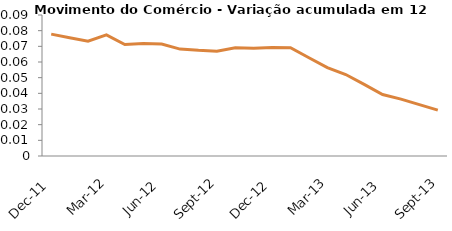
| Category | Series 5 |
|---|---|
| 2011-12-01 | 0.078 |
| 2012-01-01 | 0.075 |
| 2012-02-01 | 0.073 |
| 2012-03-01 | 0.077 |
| 2012-04-01 | 0.071 |
| 2012-05-01 | 0.072 |
| 2012-06-01 | 0.071 |
| 2012-07-01 | 0.068 |
| 2012-08-01 | 0.067 |
| 2012-09-01 | 0.067 |
| 2012-10-01 | 0.069 |
| 2012-11-01 | 0.069 |
| 2012-12-01 | 0.069 |
| 2013-01-01 | 0.069 |
| 2013-02-01 | 0.063 |
| 2013-03-01 | 0.056 |
| 2013-04-01 | 0.052 |
| 2013-05-01 | 0.046 |
| 2013-06-01 | 0.039 |
| 2013-07-01 | 0.036 |
| 2013-08-01 | 0.033 |
| 2013-09-01 | 0.029 |